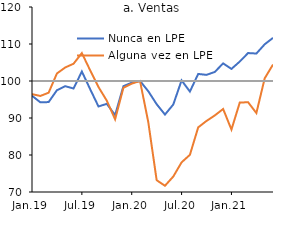
| Category | Nunca en LPE | Alguna vez en LPE | Series 2 |
|---|---|---|---|
| 2019-01-01 | 96.021 | 96.456 | 100 |
| 2019-02-01 | 94.238 | 95.956 | 100 |
| 2019-03-01 | 94.302 | 96.838 | 100 |
| 2019-04-01 | 97.509 | 102.035 | 100 |
| 2019-05-01 | 98.599 | 103.659 | 100 |
| 2019-06-01 | 97.97 | 104.67 | 100 |
| 2019-07-01 | 102.557 | 107.543 | 100 |
| 2019-08-01 | 97.783 | 102.886 | 100 |
| 2019-09-01 | 93.118 | 98.372 | 100 |
| 2019-10-01 | 93.828 | 94.683 | 100 |
| 2019-11-01 | 90.784 | 89.648 | 100 |
| 2019-12-01 | 98.603 | 98.179 | 100 |
| 2020-01-01 | 99.541 | 99.292 | 100 |
| 2020-02-01 | 100 | 100 | 100 |
| 2020-03-01 | 97.211 | 88.771 | 100 |
| 2020-04-01 | 93.731 | 73.194 | 100 |
| 2020-05-01 | 90.928 | 71.683 | 100 |
| 2020-06-01 | 93.645 | 74.179 | 100 |
| 2020-07-01 | 100.167 | 78.017 | 100 |
| 2020-08-01 | 97.148 | 80.045 | 100 |
| 2020-09-01 | 101.91 | 87.471 | 100 |
| 2020-10-01 | 101.658 | 89.211 | 100 |
| 2020-11-01 | 102.453 | 90.706 | 100 |
| 2020-12-01 | 104.77 | 92.434 | 100 |
| 2021-01-01 | 103.268 | 86.873 | 100 |
| 2021-02-01 | 105.251 | 94.168 | 100 |
| 2021-03-01 | 107.554 | 94.266 | 100 |
| 2021-04-01 | 107.423 | 91.344 | 100 |
| 2021-05-01 | 109.915 | 100.712 | 100 |
| 2021-06-01 | 111.659 | 104.448 | 100 |